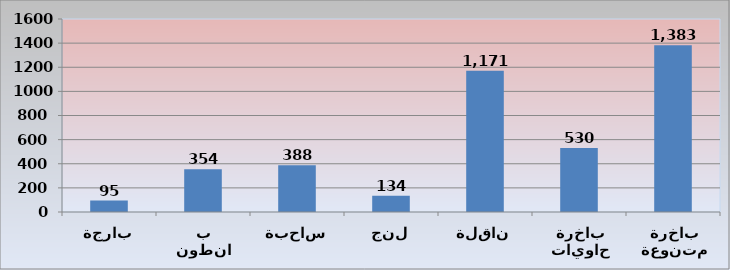
| Category | Series 0 |
|---|---|
| بارجة | 95 |
| بانطون | 354 |
| ساحبة | 388 |
| لنج | 134 |
| ناقلة | 1171 |
| باخرة حاويات | 530 |
| باخرة متنوعة | 1383 |